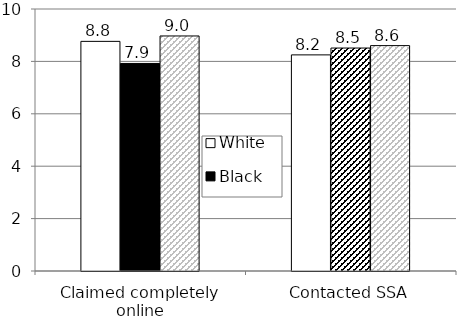
| Category | White | Black | Hispanic |
|---|---|---|---|
| Claimed completely online | 8.764 | 7.921 | 8.971 |
| Contacted SSA | 8.249 | 8.51 | 8.602 |